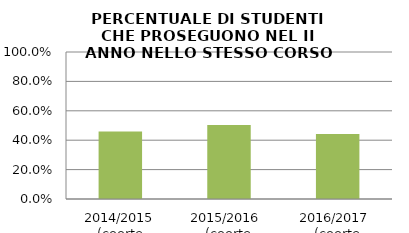
| Category | 2014/2015 (coorte 2013/14) 2015/2016  (coorte 2014/15) 2016/2017  (coorte 2015/16) |
|---|---|
| 2014/2015 (coorte 2013/14) | 0.459 |
| 2015/2016  (coorte 2014/15) | 0.503 |
| 2016/2017  (coorte 2015/16) | 0.442 |